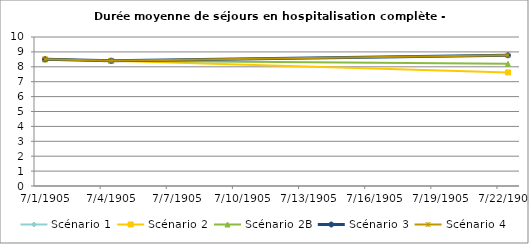
| Category | Scénario 1 | Scénario 2 | Scénario 2B | Scénario 3 | Scénario 4 |
|---|---|---|---|---|---|
| 2009.0 | 8.503 | 8.503 | 8.503 | 8.503 | 8.503 |
| 2012.0 | 8.407 | 8.407 | 8.407 | 8.407 | 8.407 |
| 2030.0 | 8.772 | 7.622 | 8.2 | 8.772 | 8.772 |